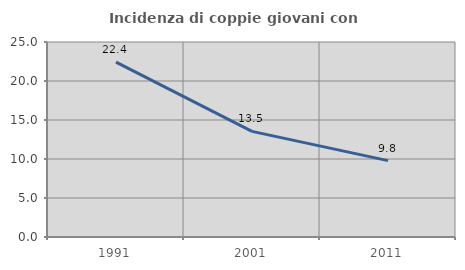
| Category | Incidenza di coppie giovani con figli |
|---|---|
| 1991.0 | 22.428 |
| 2001.0 | 13.544 |
| 2011.0 | 9.796 |